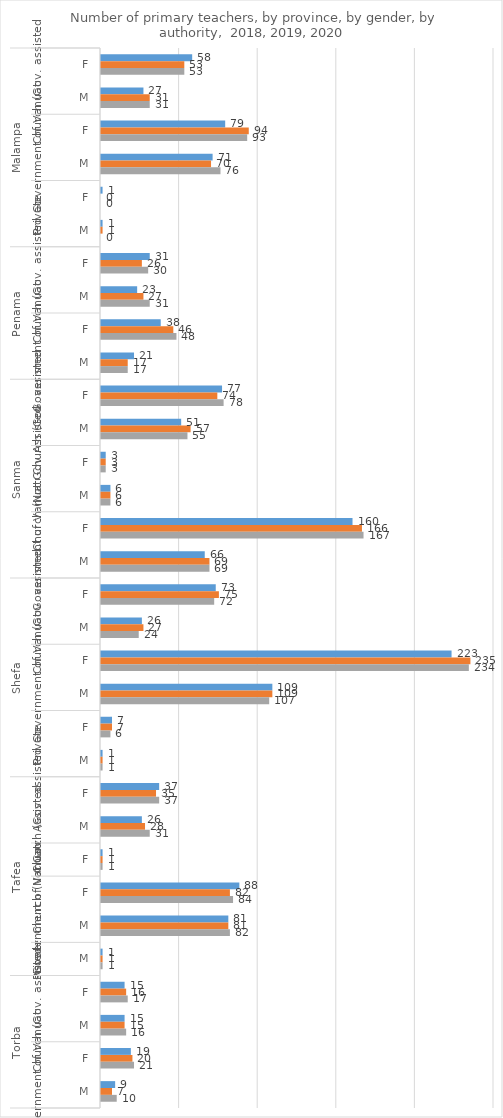
| Category | 2018 | 2019 | 2020 |
|---|---|---|---|
| 0 | 58 | 53 | 53 |
| 1 | 27 | 31 | 31 |
| 2 | 79 | 94 | 93 |
| 3 | 71 | 70 | 76 |
| 4 | 1 | 0 | 0 |
| 5 | 1 | 1 | 0 |
| 6 | 31 | 26 | 30 |
| 7 | 23 | 27 | 31 |
| 8 | 38 | 46 | 48 |
| 9 | 21 | 17 | 17 |
| 10 | 77 | 74 | 78 |
| 11 | 51 | 57 | 55 |
| 12 | 3 | 3 | 3 |
| 13 | 6 | 6 | 6 |
| 14 | 160 | 166 | 167 |
| 15 | 66 | 69 | 69 |
| 16 | 73 | 75 | 72 |
| 17 | 26 | 27 | 24 |
| 18 | 223 | 235 | 234 |
| 19 | 109 | 109 | 107 |
| 20 | 7 | 7 | 6 |
| 21 | 1 | 1 | 1 |
| 22 | 37 | 35 | 37 |
| 23 | 26 | 28 | 31 |
| 24 | 1 | 1 | 1 |
| 25 | 88 | 82 | 84 |
| 26 | 81 | 81 | 82 |
| 27 | 1 | 1 | 1 |
| 28 | 15 | 16 | 17 |
| 29 | 15 | 15 | 16 |
| 30 | 19 | 20 | 21 |
| 31 | 9 | 7 | 10 |